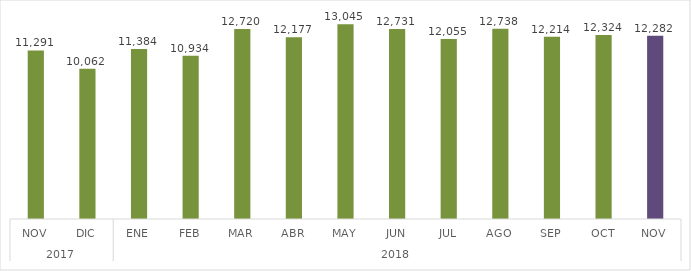
| Category | Exportaciones Totales |
|---|---|
| 0 | 11291.317 |
| 1 | 10062.33 |
| 2 | 11383.642 |
| 3 | 10934.177 |
| 4 | 12720.499 |
| 5 | 12176.906 |
| 6 | 13045.126 |
| 7 | 12730.537 |
| 8 | 12055.395 |
| 9 | 12738.189 |
| 10 | 12213.533 |
| 11 | 12324.232 |
| 12 | 12282.161 |